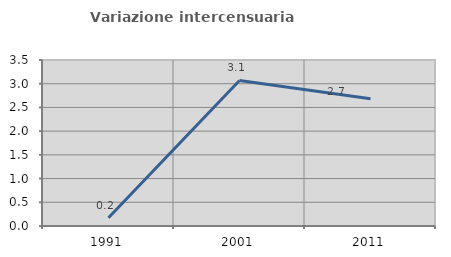
| Category | Variazione intercensuaria annua |
|---|---|
| 1991.0 | 0.174 |
| 2001.0 | 3.068 |
| 2011.0 | 2.685 |